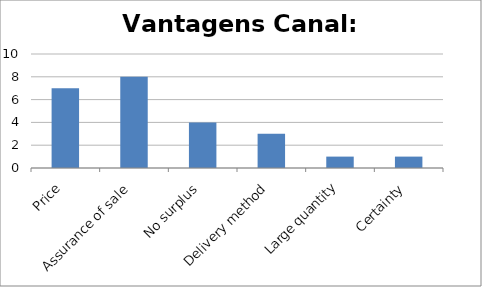
| Category | Series 0 |
|---|---|
| Price | 7 |
| Assurance of sale | 8 |
| No surplus | 4 |
| Delivery method | 3 |
| Large quantity | 1 |
| Certainty | 1 |